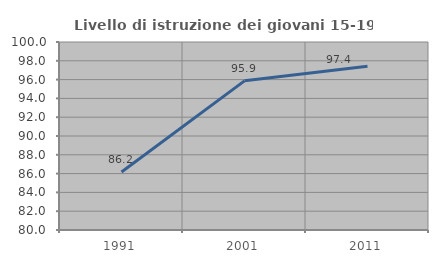
| Category | Livello di istruzione dei giovani 15-19 anni |
|---|---|
| 1991.0 | 86.17 |
| 2001.0 | 95.866 |
| 2011.0 | 97.426 |